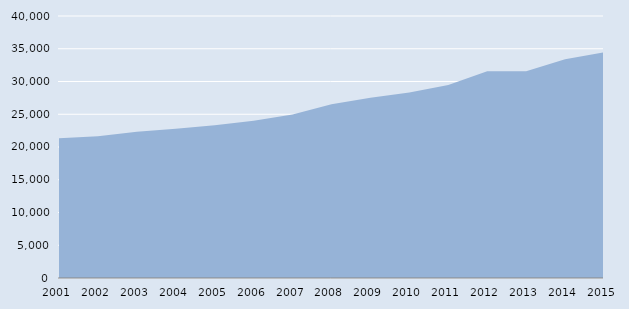
| Category | Series 0 |
|---|---|
| 2001.0 | 21331 |
| 2002.0 | 21657 |
| 2003.0 | 22324 |
| 2004.0 | 22795 |
| 2005.0 | 23337 |
| 2006.0 | 24005 |
| 2007.0 | 24950 |
| 2008.0 | 26541 |
| 2009.0 | 27532 |
| 2010.0 | 28310 |
| 2011.0 | 29453 |
| 2012.0 | 31560 |
| 2013.0 | 31564 |
| 2014.0 | 33388 |
| 2015.0 | 34455 |